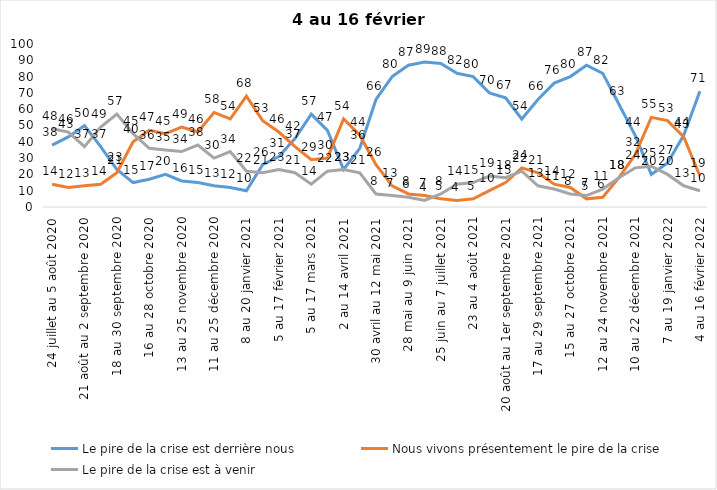
| Category | Le pire de la crise est derrière nous | Nous vivons présentement le pire de la crise | Le pire de la crise est à venir |
|---|---|---|---|
| 24 juillet au 5 août 2020 | 38 | 14 | 48 |
| 7 au 19 août 2020 | 43 | 12 | 46 |
| 21 août au 2 septembre 2020 | 50 | 13 | 37 |
| 4 au 16 septembre 2020 | 37 | 14 | 49 |
| 18 au 30 septembre 2020 | 23 | 21 | 57 |
| 2 au 14 octobre 2020 | 15 | 40 | 45 |
| 16 au 28 octobre 2020 | 17 | 47 | 36 |
| 30 octobre au 11 novembre 2020 | 20 | 45 | 35 |
| 13 au 25 novembre 2020 | 16 | 49 | 34 |
| 27 au 9 décembre 2020 | 15 | 46 | 38 |
| 11 au 25 décembre 2020 | 13 | 58 | 30 |
| 25 décembre 2020 au 6 janvier 2021 | 12 | 54 | 34 |
| 8 au 20 janvier 2021 | 10 | 68 | 22 |
| 22 janvier au 3 février 2021 | 26 | 53 | 21 |
| 5 au 17 février 2021 | 31 | 46 | 23 |
| 19 février au 3 mars 2021 | 42 | 37 | 21 |
| 5 au 17 mars 2021 | 57 | 29 | 14 |
| 19 au 31 mars 2021 | 47 | 30 | 22 |
| 2 au 14 avril 2021 | 23 | 54 | 23 |
| 16 au 28 avril 2021 | 36 | 44 | 21 |
| 30 avril au 12 mai 2021 | 66 | 26 | 8 |
| 14 au 26 mai 2021 | 80 | 13 | 7 |
| 28 mai au 9 juin 2021 | 87 | 8 | 6 |
| 11 au 23 juin 2021 | 89 | 7 | 4 |
| 25 juin au 7 juillet 2021 | 88 | 5 | 8 |
| 9 au 21 juillet 2021 | 82 | 4 | 14 |
| 23 au 4 août 2021 | 80 | 5 | 15 |
| 6 au 18 août 2021 | 70 | 10 | 19 |
| 20 août au 1er septembre 2021 | 67 | 15 | 18 |
| 3 au 15 septembre 2021 | 54 | 24 | 22 |
| 17 au 29 septembre 2021 | 66 | 21 | 13 |
| 1 au 13 octobre 2021 | 76 | 14 | 11 |
| 15 au 27 octobre 2021 | 80 | 12 | 8 |
| 29 octobre au 10 novembre 2021 | 87 | 5 | 7 |
| 12 au 24 novembre 2021 | 82 | 6 | 11 |
| 26 novembre au 8 décembre 2021 | 63 | 18 | 18 |
| 10 au 22 décembre 2021 | 44 | 32 | 24 |
| 24 décembre 2021 au 5 janvier 2022 2022 | 20 | 55 | 25 |
| 7 au 19 janvier 2022 | 27 | 53 | 20 |
| 21 janvier au 2 février 2022 | 44 | 43 | 13 |
| 4 au 16 février 2022 | 71 | 19 | 10 |